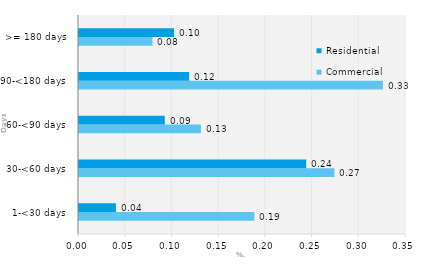
| Category | Commercial | Residential |
|---|---|---|
| 1-<30 days | 0.188 | 0.039 |
| 30-<60 days | 0.273 | 0.243 |
| 60-<90 days | 0.13 | 0.092 |
| 90-<180 days | 0.325 | 0.118 |
| >= 180 days | 0.079 | 0.102 |